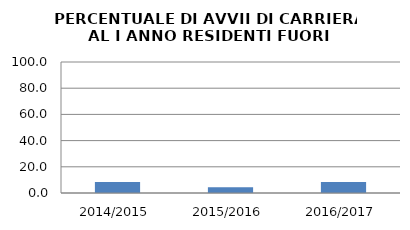
| Category | 2014/2015 2015/2016 2016/2017 |
|---|---|
| 2014/2015 | 8.387 |
| 2015/2016 | 4.31 |
| 2016/2017 | 8.403 |